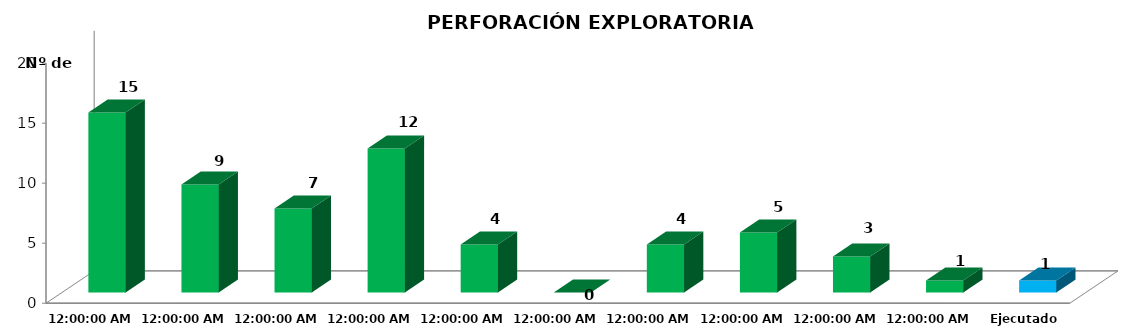
| Category | Series 0 |
|---|---|
| 2011 | 15 |
| 2012 | 9 |
| 2013 | 7 |
| 2014 | 12 |
| 2015 | 4 |
| 2016 | 0 |
| 2017 | 4 |
| 2018 | 5 |
| 2019 | 3 |
| 2020 | 1 |
| Ejecutado 2021 | 1 |